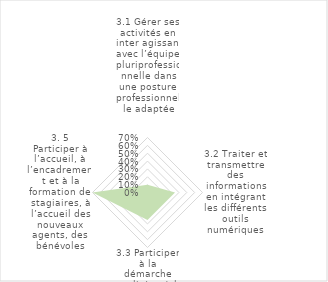
| Category | % |
|---|---|
| 0 | 0.1 |
| 1 | 0.35 |
| 2 | 0.35 |
| 3 | 0.7 |